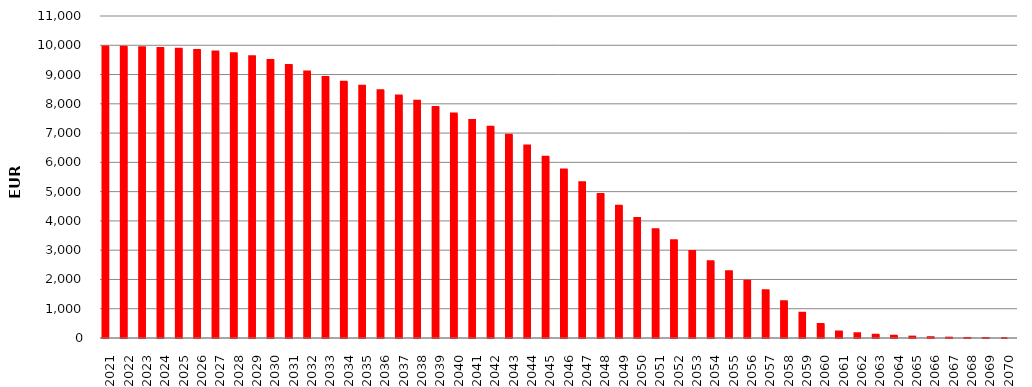
| Category | 9957878963 | SumOfMont Cred Ced act |
|---|---|---|
| 2021 | 9957448108.72 | 430854.59 |
| 2022 | 9950156609.31 | 7291499.41 |
| 2023 | 9932972634.74 | 17183974.57 |
| 2024 | 9906754563.34 | 26218071.4 |
| 2025 | 9877198402.96 | 29556160.38 |
| 2026 | 9839889496.56 | 37308906.4 |
| 2027 | 9790469010.39 | 49420486.17 |
| 2028 | 9727125001.71 | 63344008.68 |
| 2029 | 9625331521.62 | 101793480.09 |
| 2030 | 9493868473.57 | 131463048.05 |
| 2031 | 9326800026.98 | 167068446.59 |
| 2032 | 9100935445.34 | 225864581.64 |
| 2033 | 8920263812.84 | 180671632.5 |
| 2034 | 8756127662.59 | 164136150.25 |
| 2035 | 8615122507.7 | 141005154.89 |
| 2036 | 8465449851.82 | 149672655.88 |
| 2037 | 8285998220.07 | 179451631.75 |
| 2038 | 8101401284.94 | 184596935.13 |
| 2039 | 7893949580.57 | 207451704.37 |
| 2040 | 7667466328.39 | 226483252.18 |
| 2041 | 7450873736.45 | 216592591.94 |
| 2042 | 7216871775.45 | 234001961 |
| 2043 | 6940442025.2 | 276429750.25 |
| 2044 | 6575051432.67 | 365390592.53 |
| 2045 | 6193014375.8 | 382037056.87 |
| 2046 | 5752206541.38 | 440807834.42 |
| 2047 | 5319064452 | 433142089.38 |
| 2048 | 4915606876.43 | 403457575.57 |
| 2049 | 4516789851.29 | 398817025.14 |
| 2050 | 4099578858.5 | 417210992.79 |
| 2051 | 3716649677.71 | 382929180.79 |
| 2052 | 3342366770.07 | 374282907.64 |
| 2053 | 2971623473.01 | 370743297.06 |
| 2054 | 2623921647.38 | 347701825.63 |
| 2055 | 2283571283.65 | 340350363.73 |
| 2056 | 1956567740.77 | 327003542.88 |
| 2057 | 1630939909.97 | 325627830.8 |
| 2058 | 1258103934.51 | 372835975.46 |
| 2059 | 858453956.73 | 399649977.78 |
| 2060 | 478991147.03 | 379462809.7 |
| 2061 | 224629190.6 | 254361956.43 |
| 2062 | 160500825.63 | 64128364.97 |
| 2063 | 108556068.77 | 51944756.86 |
| 2064 | 74937127.78 | 33618940.99 |
| 2065 | 47258474.02 | 27678653.76 |
| 2066 | 27644886.02 | 19613588 |
| 2067 | 11701466.54 | 15943419.48 |
| 2068 | 1989485.66 | 9711980.88 |
| 2069 | 358825.72 | 1630659.94 |
| 2070 | 0 | 358825.72 |